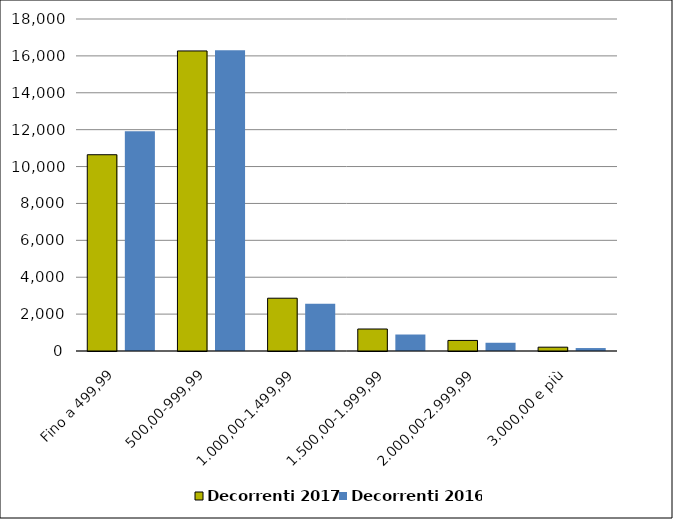
| Category | Decorrenti 2017 | Decorrenti 2016 |
|---|---|---|
| Fino a 499,99 | 10641 | 11918 |
| 500,00-999,99 | 16268 | 16302 |
| 1.000,00-1.499,99 | 2862 | 2567 |
| 1.500,00-1.999,99 | 1192 | 894 |
| 2.000,00-2.999,99 | 573 | 447 |
| 3.000,00 e più | 207 | 160 |